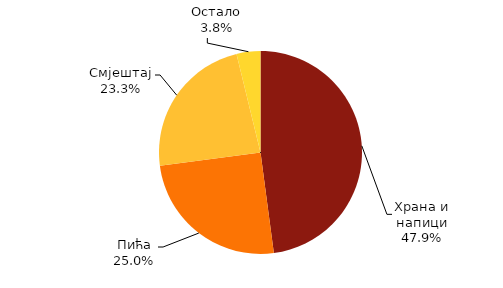
| Category | Column2 |
|---|---|
| Храна и напици | 47.9 |
| Пића | 25 |
| Смјештај | 23.3 |
| Остало | 3.8 |